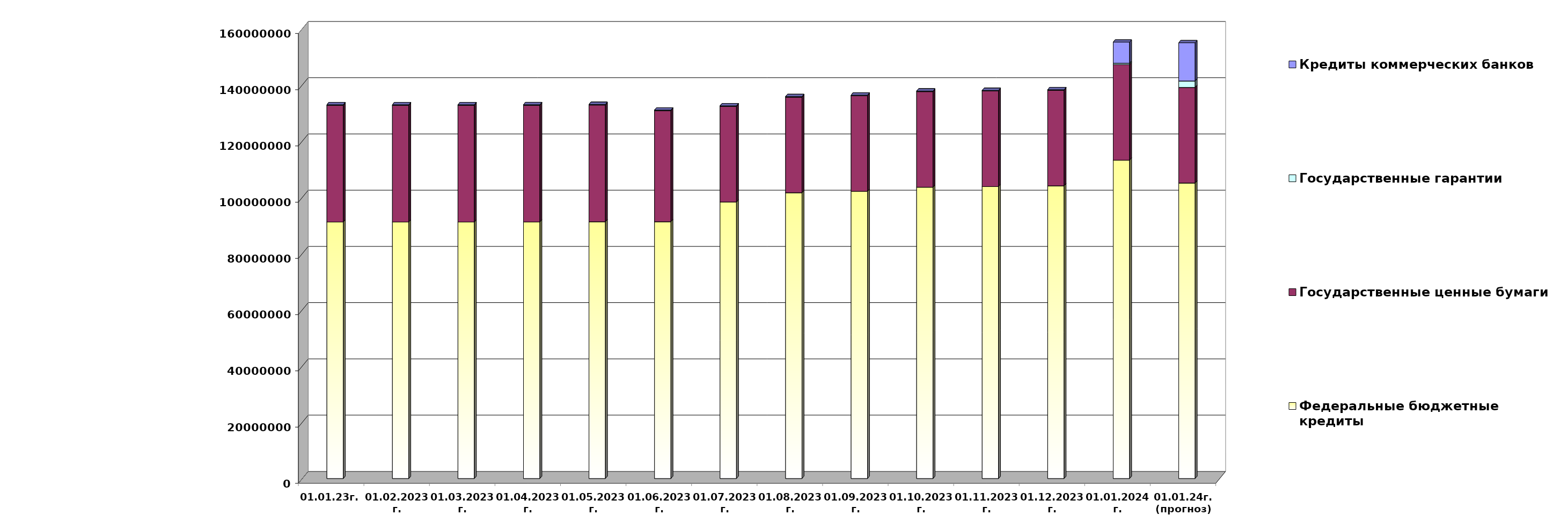
| Category | Федеральные бюджетные кредиты | Государственные ценные бумаги  | Государственные гарантии | Кредиты коммерческих банков |
|---|---|---|---|---|
| 01.01.23г. | 91228290.06 | 41500000 | 219957.743 | 0 |
| 01.02.2023г. | 91228290.06 | 41500000 | 217186.67 | 0 |
| 01.03.2023г. | 91228290.06 | 41500000 | 217186.67 | 0 |
| 01.04.2023г. | 91246617.843 | 41500000 | 218702.544 | 0 |
| 01.05.2023г. | 91334953.062 | 41500000 | 216632.858 | 0 |
| 01.06.2023г. | 91334953.062 | 39500000 | 201889.62 | 0 |
| 01.07.2023г. | 98352839.325 | 34000000 | 202402.323 | 0 |
| 01.08.2023г. | 101647637.335 | 34000000 | 198707.557 | 0 |
| 01.09.2023г. | 102154910.819 | 34000000 | 198971.052 | 0 |
| 01.10.2023г. | 103607689.942 | 34000000 | 199238.75 | 0 |
| 01.11.2023г. | 103839945.713 | 34000000 | 192112.881 | 0 |
| 01.12.2023г. | 104096716.081 | 34000000 | 190641.019 | 0 |
| 01.01.2024г. | 113223150.103 | 34000000 | 492844.914 | 7500000 |
| 01.01.24г.
(прогноз) | 105098423.5 | 34000000 | 2296427.8 | 13594032.8 |